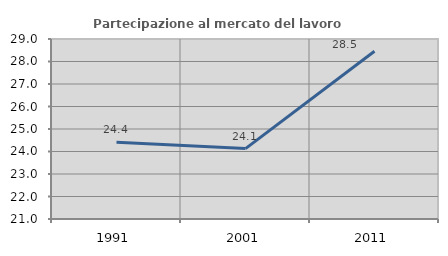
| Category | Partecipazione al mercato del lavoro  femminile |
|---|---|
| 1991.0 | 24.41 |
| 2001.0 | 24.128 |
| 2011.0 | 28.454 |